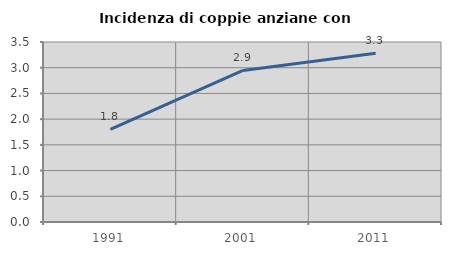
| Category | Incidenza di coppie anziane con figli |
|---|---|
| 1991.0 | 1.803 |
| 2001.0 | 2.947 |
| 2011.0 | 3.283 |